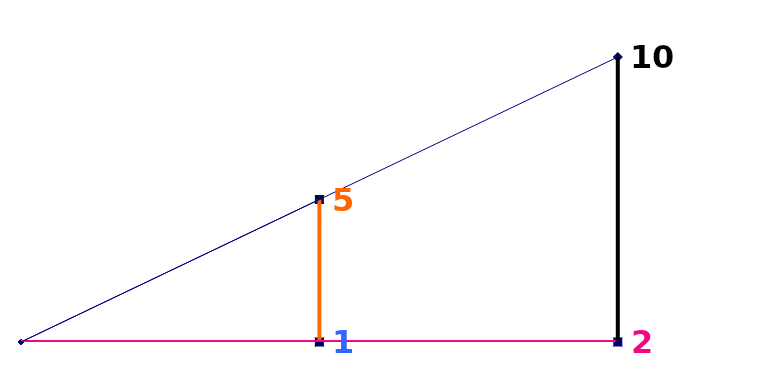
| Category | Series 0 |
|---|---|
| 0.0 | 0 |
| 1.0 | 0 |
| 1.0 | 5 |
| 0.0 | 0 |
| 0.0 | 0 |
| 2.0 | 0 |
| 2.0 | 10 |
| 0.0 | 0 |